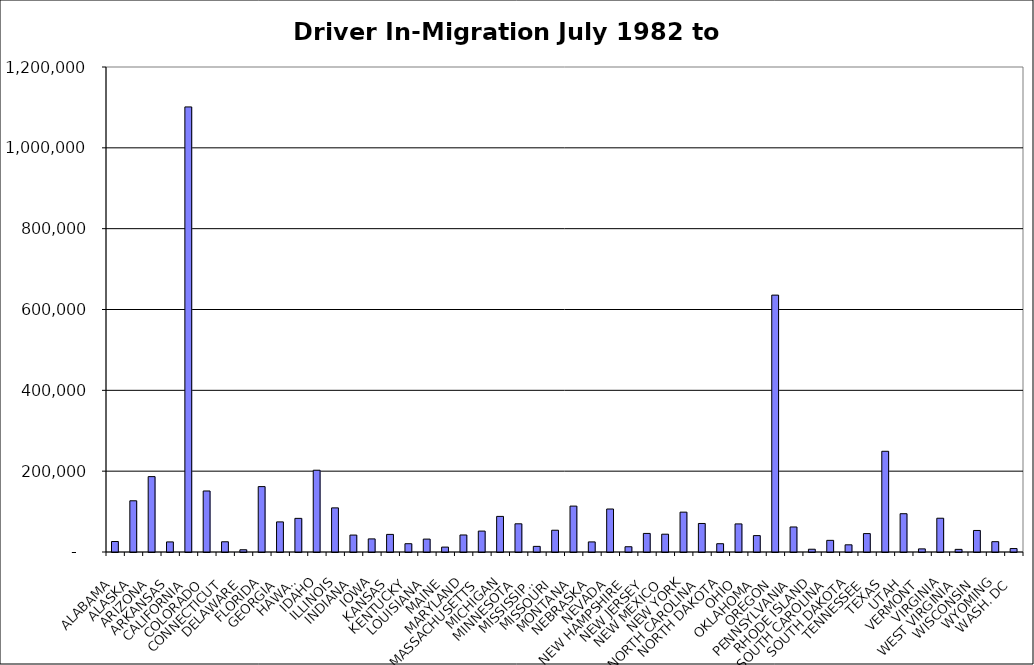
| Category | Series 0 |
|---|---|
| ALABAMA | 25941.5 |
| ALASKA | 126714.5 |
| ARIZONA | 186511 |
| ARKANSAS | 24969.5 |
| CALIFORNIA | 1101194.5 |
| COLORADO | 150969 |
| CONNECTICUT | 25321 |
| DELAWARE | 5548.5 |
| FLORIDA | 161792 |
| GEORGIA | 74465 |
| HAWAII | 83211.5 |
| IDAHO | 202341.5 |
| ILLINOIS | 109171.5 |
| INDIANA | 41870 |
| IOWA | 32397.5 |
| KANSAS | 43553.5 |
| KENTUCKY | 20506 |
| LOUISIANA | 31924.5 |
| MAINE | 12112.5 |
| MARYLAND | 42101 |
| MASSACHUSETTS | 51728 |
| MICHIGAN | 88081 |
| MINNESOTA | 69748.5 |
| MISSISSIPPI | 13914 |
| MISSOURI | 53871 |
| MONTANA | 113554 |
| NEBRASKA | 24968.5 |
| NEVADA | 106368 |
| NEW HAMPSHIRE | 13011.5 |
| NEW JERSEY | 45956 |
| NEW MEXICO | 44057 |
| NEW YORK | 98593 |
| NORTH CAROLINA | 70561.5 |
| NORTH DAKOTA | 20503.5 |
| OHIO | 69497.5 |
| OKLAHOMA | 40577 |
| OREGON | 635582 |
| PENNSYLVANIA | 61898.5 |
| RHODE ISLAND | 6870 |
| SOUTH CAROLINA | 28821.5 |
| SOUTH DAKOTA | 17778.5 |
| TENNESSEE | 45553.5 |
| TEXAS | 249185 |
| UTAH | 94717.5 |
| VERMONT | 7708 |
| VIRGINIA | 83551 |
| WEST VIRGINIA | 6528.5 |
| WISCONSIN | 53297.5 |
| WYOMING | 25524 |
| WASH. DC | 8523 |